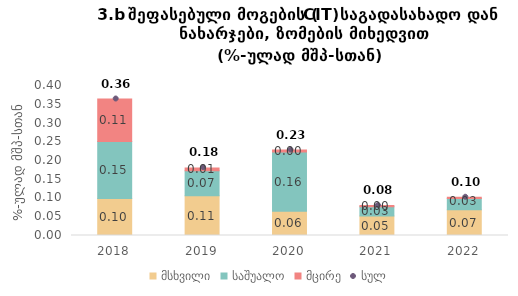
| Category | მსხვილი | საშუალო | მცირე |
|---|---|---|---|
| 2018.0 | 0.099 | 0.152 | 0.113 |
| 2019.0 | 0.106 | 0.067 | 0.007 |
| 2020.0 | 0.065 | 0.158 | 0.005 |
| 2021.0 | 0.052 | 0.025 | 0.003 |
| 2022.0 | 0.069 | 0.03 | 0.003 |